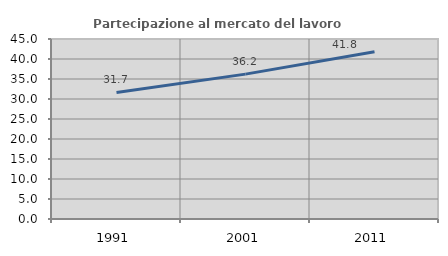
| Category | Partecipazione al mercato del lavoro  femminile |
|---|---|
| 1991.0 | 31.651 |
| 2001.0 | 36.216 |
| 2011.0 | 41.802 |